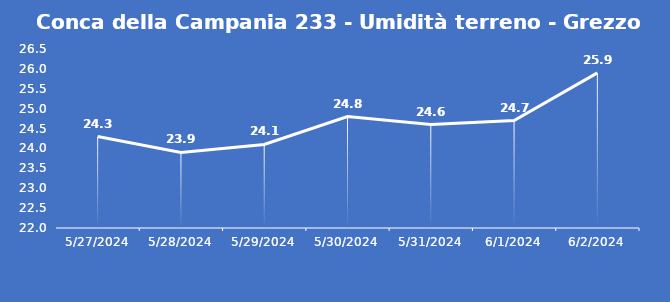
| Category | Conca della Campania 233 - Umidità terreno - Grezzo (%VWC) |
|---|---|
| 5/27/24 | 24.3 |
| 5/28/24 | 23.9 |
| 5/29/24 | 24.1 |
| 5/30/24 | 24.8 |
| 5/31/24 | 24.6 |
| 6/1/24 | 24.7 |
| 6/2/24 | 25.9 |